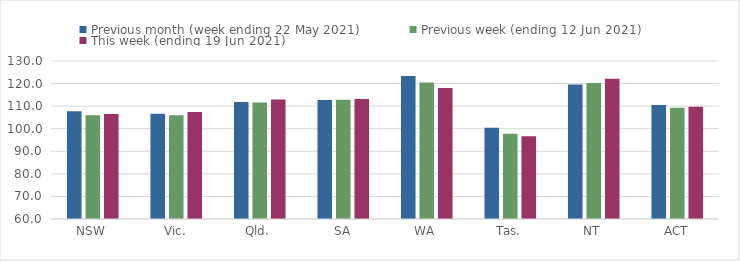
| Category | Previous month (week ending 22 May 2021) | Previous week (ending 12 Jun 2021) | This week (ending 19 Jun 2021) |
|---|---|---|---|
| NSW | 107.7 | 106 | 106.56 |
| Vic. | 106.67 | 105.98 | 107.36 |
| Qld. | 111.86 | 111.6 | 112.96 |
| SA | 112.67 | 112.82 | 113.18 |
| WA | 123.35 | 120.45 | 118.03 |
| Tas. | 100.47 | 97.81 | 96.64 |
| NT | 119.6 | 120.2 | 122.16 |
| ACT | 110.55 | 109.34 | 109.77 |